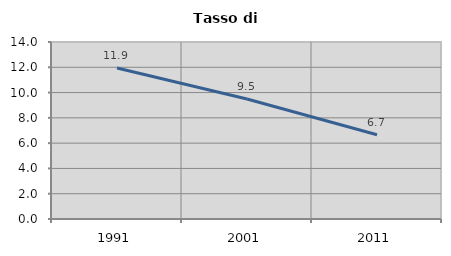
| Category | Tasso di disoccupazione   |
|---|---|
| 1991.0 | 11.95 |
| 2001.0 | 9.494 |
| 2011.0 | 6.667 |